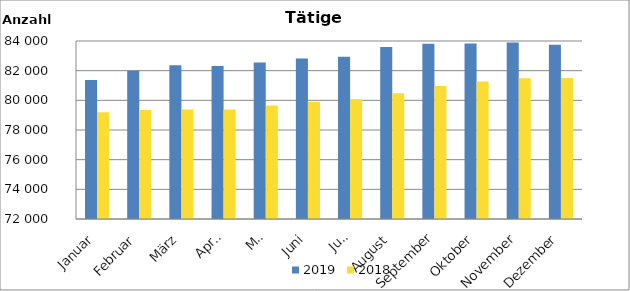
| Category | 2019 | 2018 |
|---|---|---|
| Januar | 81363 | 79195 |
| Februar | 81998 | 79348 |
| März | 82364 | 79384 |
| April | 82323 | 79381 |
| Mai | 82546 | 79644 |
| Juni | 82813 | 79888 |
| Juli | 82933 | 80067 |
| August | 83596 | 80484 |
| September | 83807 | 80963 |
| Oktober | 83839 | 81266 |
| November | 83896 | 81487 |
| Dezember | 83743 | 81514 |